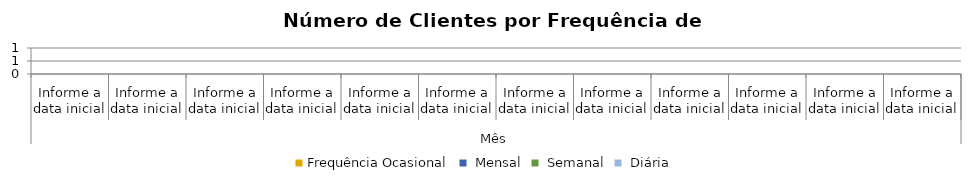
| Category | Frequência |
|---|---|
| 0 | 0 |
| 1 | 0 |
| 2 | 0 |
| 3 | 0 |
| 4 | 0 |
| 5 | 0 |
| 6 | 0 |
| 7 | 0 |
| 8 | 0 |
| 9 | 0 |
| 10 | 0 |
| 11 | 0 |